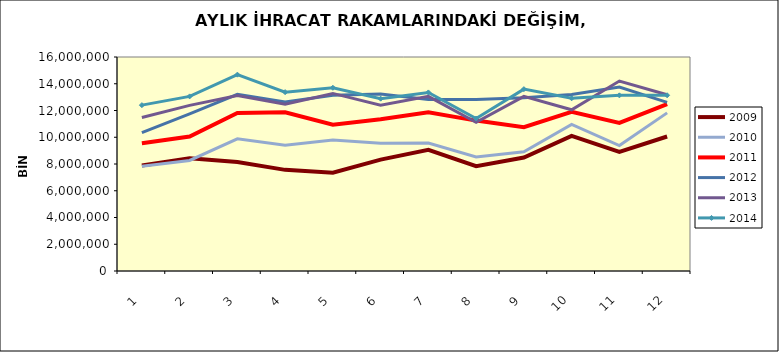
| Category | 2009 | 2010 | 2011 | 2012 | 2013 | 2014 |
|---|---|---|---|---|---|---|
| 0 | 7884493.524 | 7828748.058 | 9551084.639 | 10348187.166 | 11481521.079 | 12401039.861 |
| 1 | 8435115.834 | 8263237.814 | 10059126.307 | 11748000.124 | 12385690.909 | 13054023.337 |
| 2 | 8155485.081 | 9886488.171 | 11811085.16 | 13208572.977 | 13122058.141 | 14681761.442 |
| 3 | 7561696.283 | 9396006.654 | 11873269.447 | 12630226.718 | 12468202.903 | 13373287.076 |
| 4 | 7346407.528 | 9799958.117 | 10943364.372 | 13131530.961 | 13277209.017 | 13699161.366 |
| 5 | 8329692.783 | 9542907.644 | 11349953.558 | 13231198.688 | 12399973.962 | 12885863.393 |
| 6 | 9055733.671 | 9564682.545 | 11860004.271 | 12830675.307 | 13059519.685 | 13350844.19 |
| 7 | 7839908.842 | 8523451.973 | 11245124.657 | 12831394.572 | 11118300.903 | 11399550.571 |
| 8 | 8480708.387 | 8909230.521 | 10750626.099 | 12952651.722 | 13060371.039 | 13597288.942 |
| 9 | 10095768.03 | 10963586.27 | 11907219.297 | 13190769.655 | 12053704.638 | 12910949.214 |
| 10 | 8903010.773 | 9382369.718 | 11078524.743 | 13753052.493 | 14201227.351 | 13131524.414 |
| 11 | 10054591.867 | 11822551.699 | 12477486.28 | 12605476.173 | 13174857.46 | 13136763.38 |